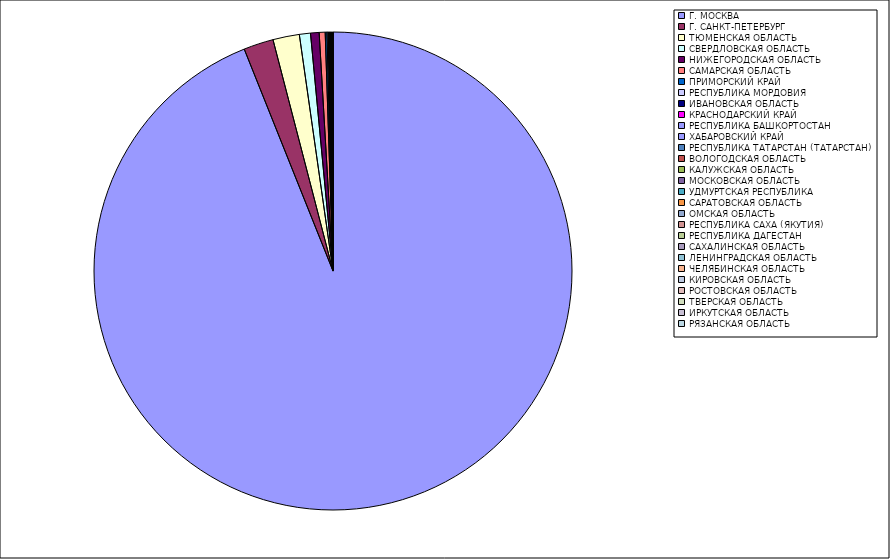
| Category | Оборот |
|---|---|
| Г. МОСКВА | 93.913 |
| Г. САНКТ-ПЕТЕРБУРГ | 2.016 |
| ТЮМЕНСКАЯ ОБЛАСТЬ | 1.787 |
| СВЕРДЛОВСКАЯ ОБЛАСТЬ | 0.749 |
| НИЖЕГОРОДСКАЯ ОБЛАСТЬ | 0.58 |
| САМАРСКАЯ ОБЛАСТЬ | 0.402 |
| ПРИМОРСКИЙ КРАЙ | 0.117 |
| РЕСПУБЛИКА МОРДОВИЯ | 0.078 |
| ИВАНОВСКАЯ ОБЛАСТЬ | 0.045 |
| КРАСНОДАРСКИЙ КРАЙ | 0.042 |
| РЕСПУБЛИКА БАШКОРТОСТАН | 0.031 |
| ХАБАРОВСКИЙ КРАЙ | 0.029 |
| РЕСПУБЛИКА ТАТАРСТАН (ТАТАРСТАН) | 0.025 |
| ВОЛОГОДСКАЯ ОБЛАСТЬ | 0.015 |
| КАЛУЖСКАЯ ОБЛАСТЬ | 0.014 |
| МОСКОВСКАЯ ОБЛАСТЬ | 0.014 |
| УДМУРТСКАЯ РЕСПУБЛИКА | 0.012 |
| САРАТОВСКАЯ ОБЛАСТЬ | 0.012 |
| ОМСКАЯ ОБЛАСТЬ | 0.011 |
| РЕСПУБЛИКА САХА (ЯКУТИЯ) | 0.011 |
| РЕСПУБЛИКА ДАГЕСТАН | 0.009 |
| САХАЛИНСКАЯ ОБЛАСТЬ | 0.009 |
| ЛЕНИНГРАДСКАЯ ОБЛАСТЬ | 0.008 |
| ЧЕЛЯБИНСКАЯ ОБЛАСТЬ | 0.008 |
| КИРОВСКАЯ ОБЛАСТЬ | 0.007 |
| РОСТОВСКАЯ ОБЛАСТЬ | 0.006 |
| ТВЕРСКАЯ ОБЛАСТЬ | 0.006 |
| ИРКУТСКАЯ ОБЛАСТЬ | 0.006 |
| РЯЗАНСКАЯ ОБЛАСТЬ | 0.005 |